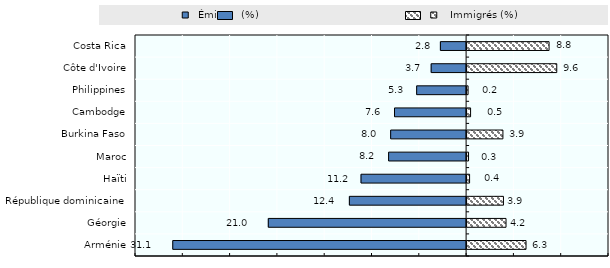
| Category |   Émigrés (%) |    Immigrés (%) |
|---|---|---|
| Arménie | -31.06 | 6.336 |
| Géorgie | -20.962 | 4.22 |
| République dominicaine | -12.39 | 3.947 |
| Haïti | -11.159 | 0.369 |
| Maroc | -8.246 | 0.257 |
| Burkina Faso | -8.027 | 3.892 |
| Cambodge | -7.621 | 0.475 |
| Philippines | -5.279 | 0.21 |
| Côte d'Ivoire | -3.745 | 9.583 |
| Costa Rica | -2.77 | 8.771 |